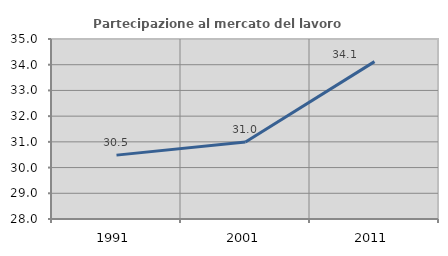
| Category | Partecipazione al mercato del lavoro  femminile |
|---|---|
| 1991.0 | 30.484 |
| 2001.0 | 30.997 |
| 2011.0 | 34.119 |